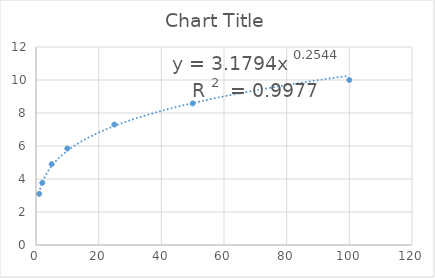
| Category | Series 0 |
|---|---|
| 1.0 | 3.1 |
| 2.0 | 3.77 |
| 5.0 | 4.9 |
| 10.0 | 5.85 |
| 25.0 | 7.3 |
| 50.0 | 8.58 |
| 100.0 | 10 |